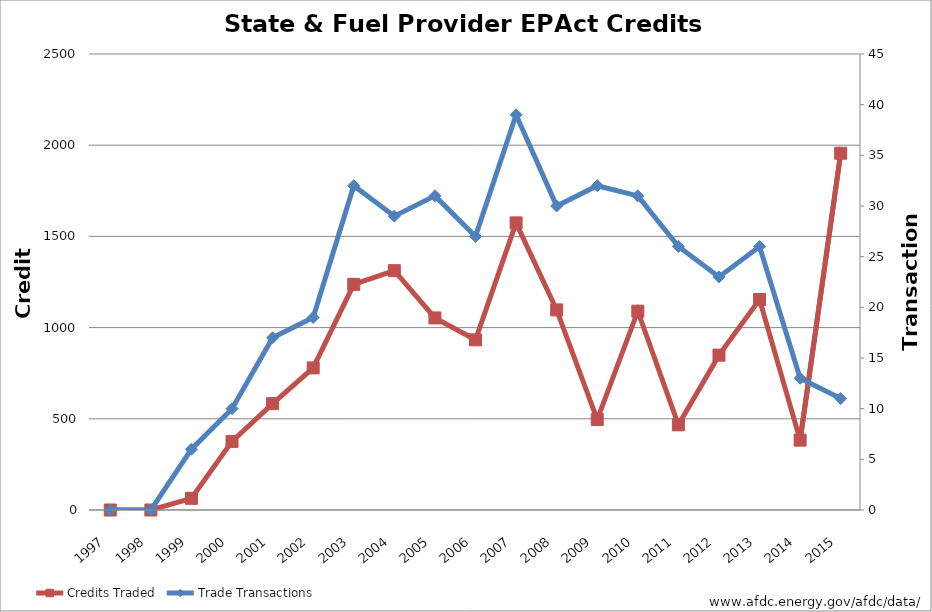
| Category | Credits Traded |
|---|---|
| 1997.0 | 0 |
| 1998.0 | 0 |
| 1999.0 | 64 |
| 2000.0 | 376 |
| 2001.0 | 583 |
| 2002.0 | 779 |
| 2003.0 | 1237 |
| 2004.0 | 1312 |
| 2005.0 | 1053 |
| 2006.0 | 933 |
| 2007.0 | 1574 |
| 2008.0 | 1097 |
| 2009.0 | 496 |
| 2010.0 | 1090 |
| 2011.0 | 467 |
| 2012.0 | 849 |
| 2013.0 | 1154 |
| 2014.0 | 383 |
| 2015.0 | 1956 |